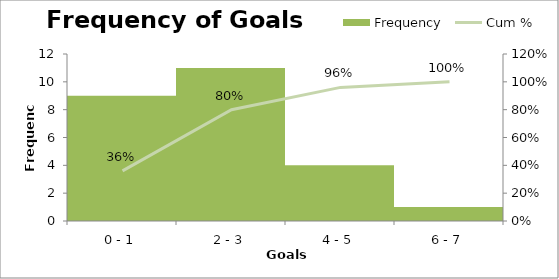
| Category | Frequency |
|---|---|
| 0 - 1 | 9 |
| 2 - 3 | 11 |
| 4 - 5 | 4 |
| 6 - 7 | 1 |